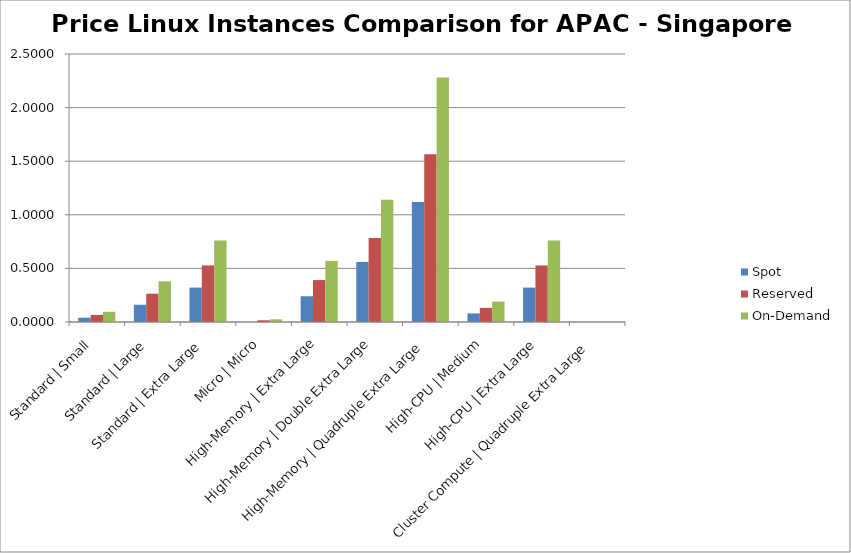
| Category | Spot | Reserved | On-Demand |
|---|---|---|---|
| Standard | Small | 0.04 | 0.066 | 0.095 |
| Standard | Large | 0.161 | 0.264 | 0.38 |
| Standard | Extra Large | 0.321 | 0.528 | 0.76 |
| Micro | Micro | 0 | 0.016 | 0.025 |
| High-Memory | Extra Large | 0.24 | 0.391 | 0.57 |
| High-Memory | Double Extra Large | 0.561 | 0.783 | 1.14 |
| High-Memory | Quadruple Extra Large | 1.119 | 1.565 | 2.28 |
| High-CPU | Medium | 0.08 | 0.132 | 0.19 |
| High-CPU | Extra Large | 0.321 | 0.528 | 0.76 |
| Cluster Compute | Quadruple Extra Large | 0 | 0 | 0 |